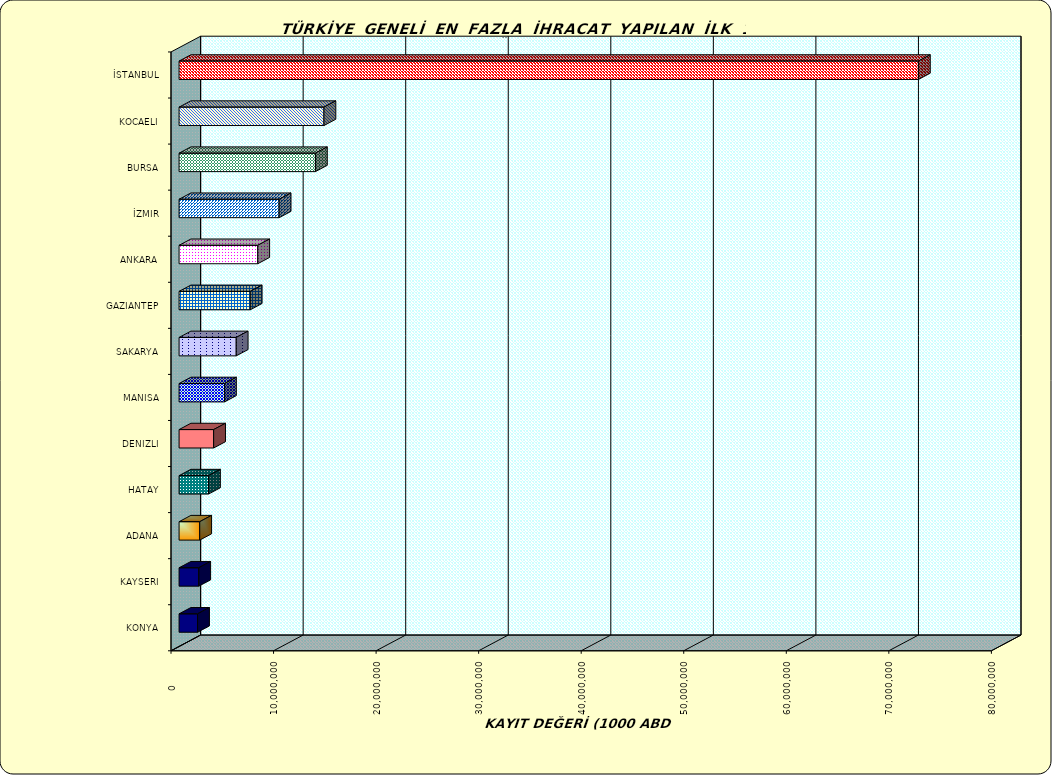
| Category | Series 0 |
|---|---|
| İSTANBUL | 72095567.797 |
| KOCAELI | 14128478.752 |
| BURSA | 13298331.954 |
| İZMIR | 9757833.283 |
| ANKARA | 7672747.622 |
| GAZIANTEP | 6939031.703 |
| SAKARYA | 5573354.043 |
| MANISA | 4429647.252 |
| DENIZLI | 3370191.472 |
| HATAY | 2871660.645 |
| ADANA | 2013927.447 |
| KAYSERI | 1919281.109 |
| KONYA | 1803149.815 |